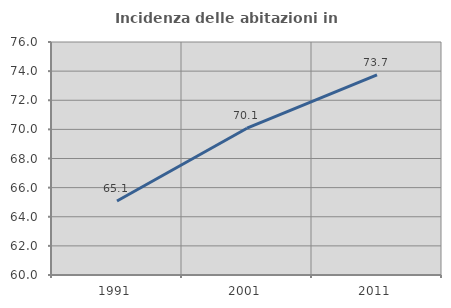
| Category | Incidenza delle abitazioni in proprietà  |
|---|---|
| 1991.0 | 65.077 |
| 2001.0 | 70.081 |
| 2011.0 | 73.739 |